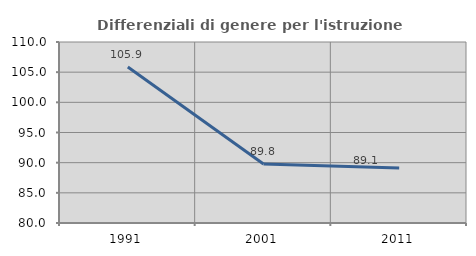
| Category | Differenziali di genere per l'istruzione superiore |
|---|---|
| 1991.0 | 105.852 |
| 2001.0 | 89.789 |
| 2011.0 | 89.12 |